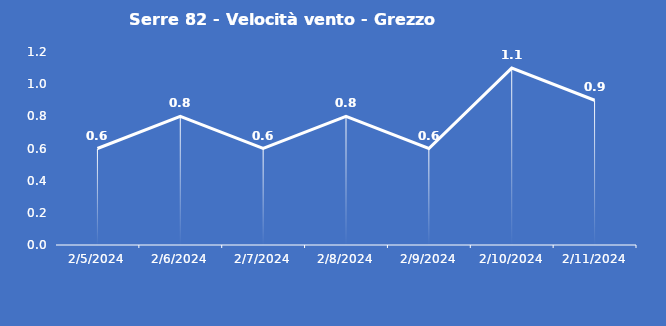
| Category | Serre 82 - Velocità vento - Grezzo (m/s) |
|---|---|
| 2/5/24 | 0.6 |
| 2/6/24 | 0.8 |
| 2/7/24 | 0.6 |
| 2/8/24 | 0.8 |
| 2/9/24 | 0.6 |
| 2/10/24 | 1.1 |
| 2/11/24 | 0.9 |